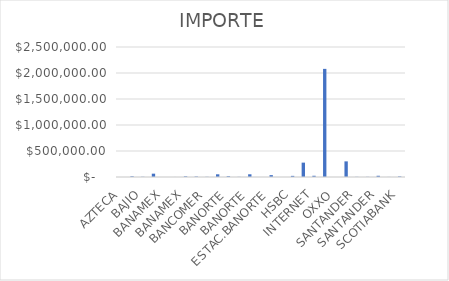
| Category | IMPORTE |
|---|---|
| AZTECA | 49.01 |
| AZTECA | 13659.18 |
| BAJIO | 4194.27 |
| BAJIO | 64101.96 |
| BANAMEX | 448.12 |
| BANAMEX | 717 |
| BANAMEX | 13185.02 |
| BANCOMER | 9475.66 |
| BANCOMER | 3693 |
| BANCOMER | 51902.68 |
| BANORTE | 16360.71 |
| BANORTE | 2718 |
| BANORTE | 52175.78 |
| BANREGIO | 315.88 |
| ESTAC.BANORTE | 35901 |
| HSBC | 531.02 |
| HSBC | 21839.35 |
| INTERNET | 276292.72 |
| INTERNET | 23874.28 |
| INTERNET | 2079295.15 |
| OXXO | 226 |
| OXXO | 300625.45 |
| SANTANDER | 2950.06 |
| SANTANDER | 3128 |
| SANTANDER | 23700.15 |
| SCOTIABANK | 1340.7 |
| SCOTIABANK | 10749.66 |